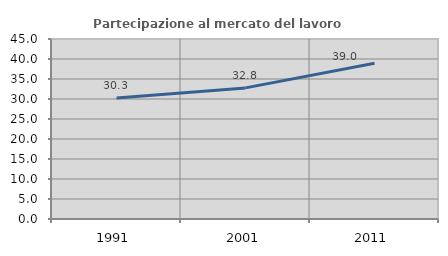
| Category | Partecipazione al mercato del lavoro  femminile |
|---|---|
| 1991.0 | 30.253 |
| 2001.0 | 32.776 |
| 2011.0 | 38.954 |